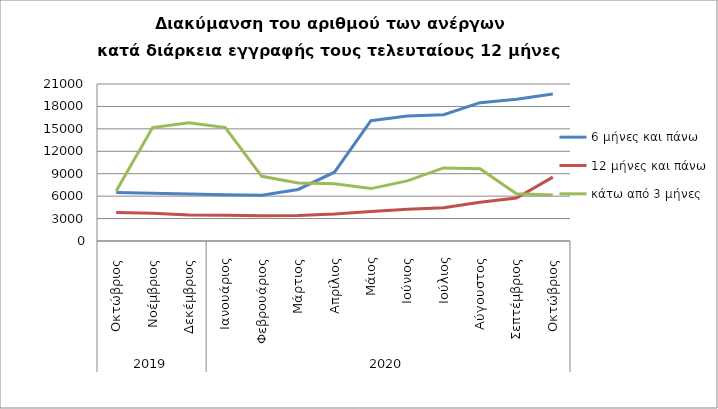
| Category | 6 μήνες και πάνω | 12 μήνες και πάνω | κάτω από 3 μήνες |
|---|---|---|---|
| 0 | 6500 | 3821 | 6686 |
| 1 | 6379 | 3715 | 15176 |
| 2 | 6275 | 3478 | 15812 |
| 3 | 6184 | 3454 | 15175 |
| 4 | 6133 | 3369 | 8651 |
| 5 | 6894 | 3423 | 7759 |
| 6 | 9204 | 3615 | 7657 |
| 7 | 16093 | 3960 | 7009 |
| 8 | 16710 | 4241 | 8045 |
| 9 | 16881 | 4440 | 9774 |
| 10 | 18501 | 5187 | 9666 |
| 11 | 18966 | 5757 | 6333 |
| 12 | 19667 | 8550 | 6158 |